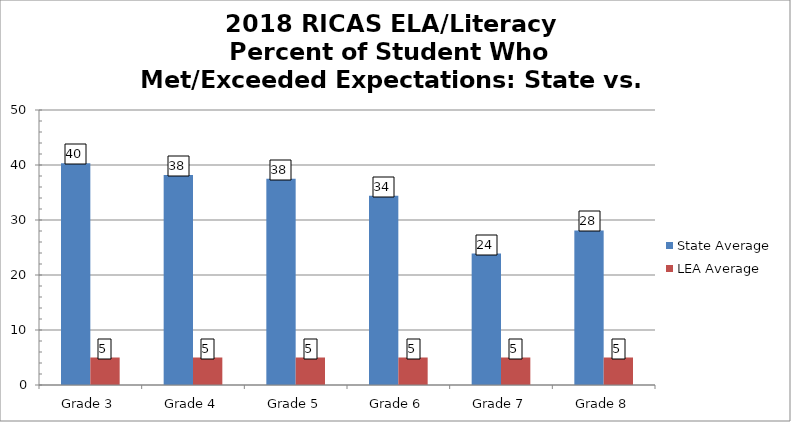
| Category | State Average | LEA Average |
|---|---|---|
| Grade 3 | 40.3 | 5 |
| Grade 4 | 38.2 | 5 |
| Grade 5 | 37.5 | 5 |
| Grade 6 | 34.4 | 5 |
| Grade 7 | 23.9 | 5 |
| Grade 8 | 28.1 | 5 |